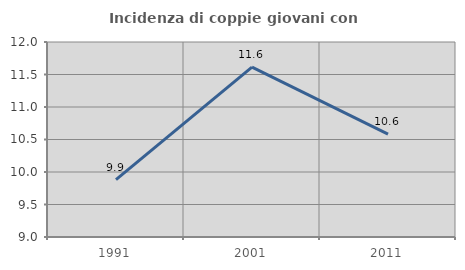
| Category | Incidenza di coppie giovani con figli |
|---|---|
| 1991.0 | 9.884 |
| 2001.0 | 11.613 |
| 2011.0 | 10.582 |